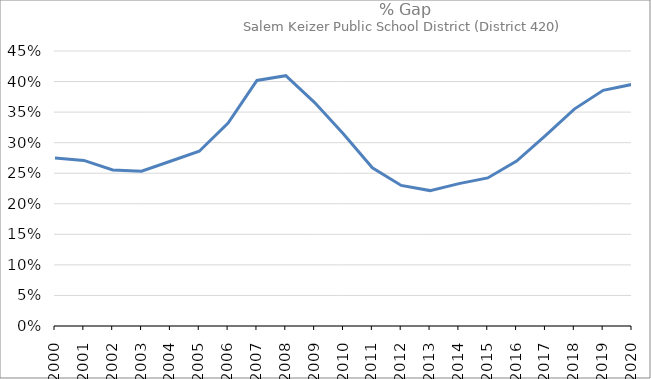
| Category | Series 0 |
|---|---|
| 2000.0 | 0.275 |
| 2001.0 | 0.271 |
| 2002.0 | 0.255 |
| 2003.0 | 0.253 |
| 2004.0 | 0.27 |
| 2005.0 | 0.286 |
| 2006.0 | 0.332 |
| 2007.0 | 0.402 |
| 2008.0 | 0.41 |
| 2009.0 | 0.366 |
| 2010.0 | 0.314 |
| 2011.0 | 0.259 |
| 2012.0 | 0.23 |
| 2013.0 | 0.222 |
| 2014.0 | 0.233 |
| 2015.0 | 0.242 |
| 2016.0 | 0.27 |
| 2017.0 | 0.311 |
| 2018.0 | 0.355 |
| 2019.0 | 0.386 |
| 2020.0 | 0.395 |